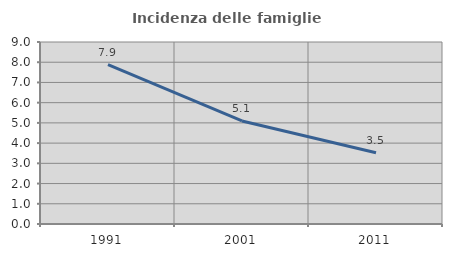
| Category | Incidenza delle famiglie numerose |
|---|---|
| 1991.0 | 7.879 |
| 2001.0 | 5.096 |
| 2011.0 | 3.526 |